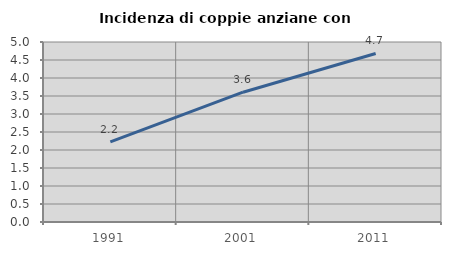
| Category | Incidenza di coppie anziane con figli |
|---|---|
| 1991.0 | 2.225 |
| 2001.0 | 3.606 |
| 2011.0 | 4.681 |